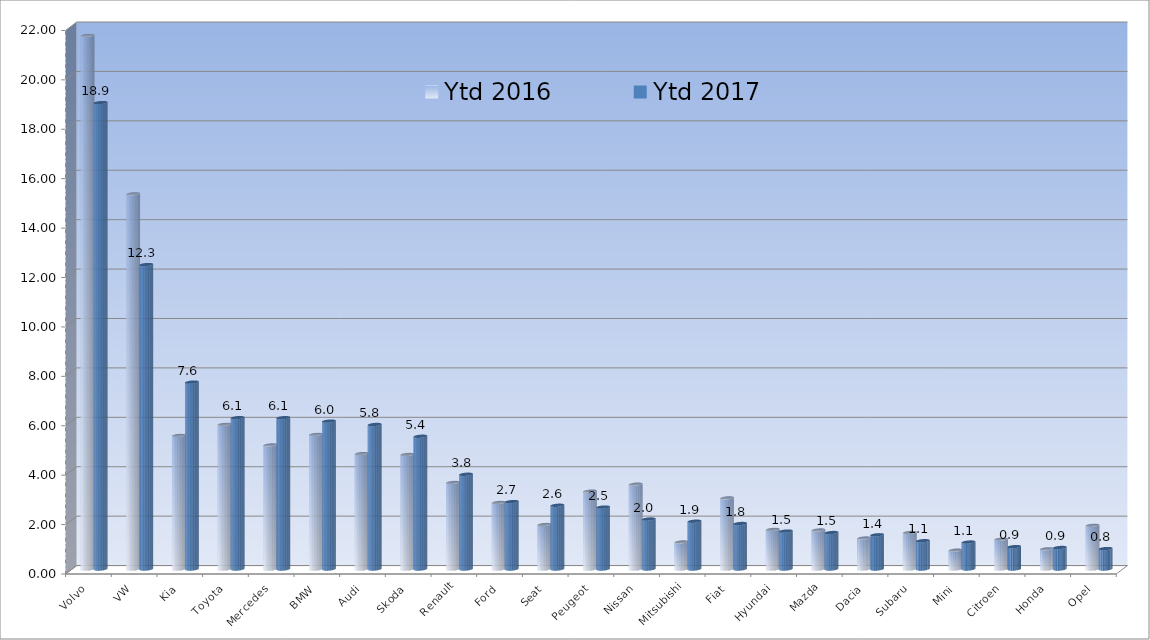
| Category | Ytd 2016 | Ytd 2017 |
|---|---|---|
| Volvo | 21.599 | 18.878 |
| VW | 15.184 | 12.322 |
| Kia | 5.407 | 7.564 |
| Toyota | 5.856 | 6.125 |
| Mercedes | 5.021 | 6.125 |
| BMW | 5.446 | 5.986 |
| Audi | 4.671 | 5.849 |
| Skoda | 4.635 | 5.373 |
| Renault | 3.503 | 3.834 |
| Ford | 2.694 | 2.728 |
| Seat | 1.8 | 2.58 |
| Peugeot | 3.15 | 2.507 |
| Nissan | 3.433 | 2.023 |
| Mitsubishi | 1.094 | 1.934 |
| Fiat | 2.878 | 1.841 |
| Hyundai | 1.602 | 1.535 |
| Mazda | 1.578 | 1.476 |
| Dacia | 1.254 | 1.384 |
| Subaru | 1.477 | 1.145 |
| Mini | 0.762 | 1.091 |
| Citroen | 1.206 | 0.905 |
| Honda | 0.817 | 0.871 |
| Opel | 1.769 | 0.827 |